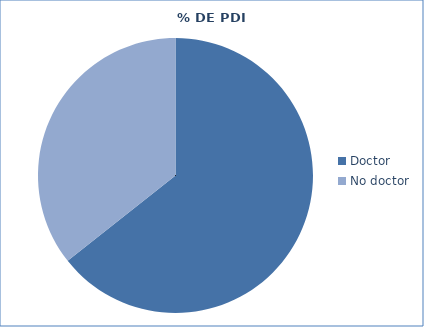
| Category | Series 0 |
|---|---|
| Doctor | 1709 |
| No doctor | 947 |